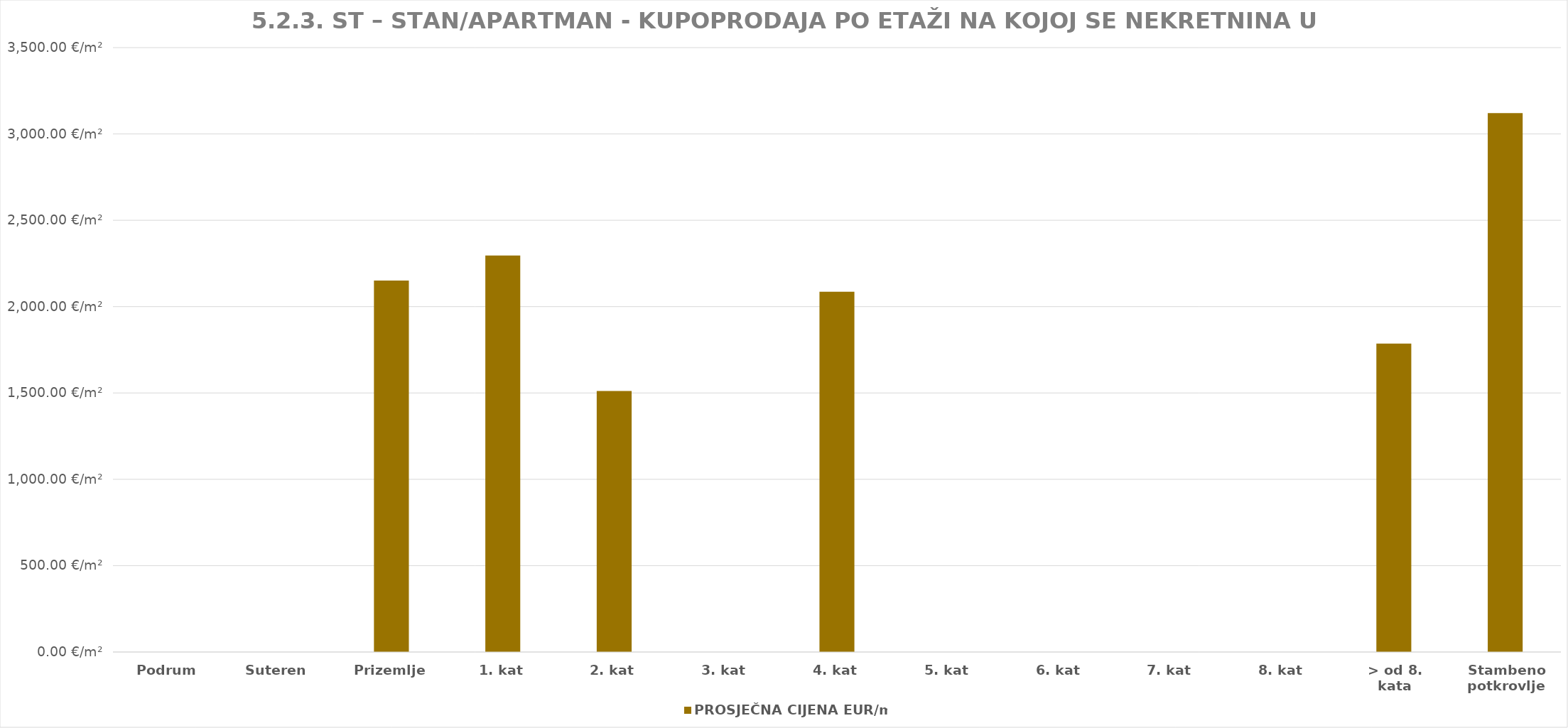
| Category | PROSJEČNA CIJENA EUR/m2 |
|---|---|
| Podrum | 0 |
| Suteren  | 0 |
| Prizemlje | 1905-11-20 09:05:31 |
| 1. kat | 1906-04-14 02:19:04 |
| 2. kat | 1904-02-19 06:14:24 |
| 3. kat | 0 |
| 4. kat | 1905-09-15 19:59:26 |
| 5. kat | 0 |
| 6. kat | 0 |
| 7. kat | 0 |
| 8. kat | 0 |
| > od 8. kata | 1904-11-20 05:54:06 |
| Stambeno potkrovlje | 1908-07-16 18:43:28 |